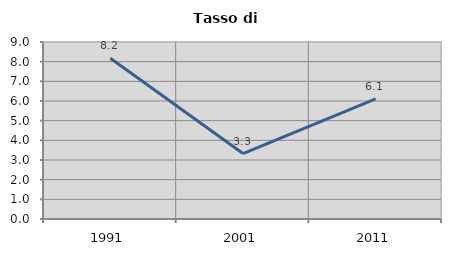
| Category | Tasso di disoccupazione   |
|---|---|
| 1991.0 | 8.174 |
| 2001.0 | 3.326 |
| 2011.0 | 6.11 |